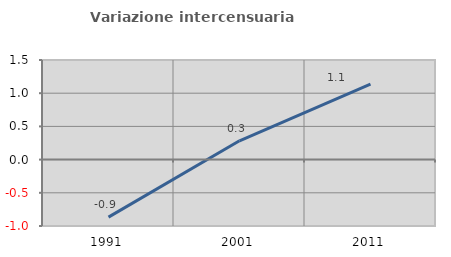
| Category | Variazione intercensuaria annua |
|---|---|
| 1991.0 | -0.867 |
| 2001.0 | 0.284 |
| 2011.0 | 1.137 |